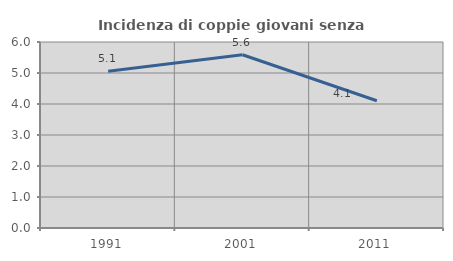
| Category | Incidenza di coppie giovani senza figli |
|---|---|
| 1991.0 | 5.06 |
| 2001.0 | 5.588 |
| 2011.0 | 4.106 |